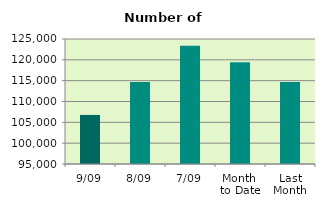
| Category | Series 0 |
|---|---|
| 9/09 | 106772 |
| 8/09 | 114698 |
| 7/09 | 123374 |
| Month 
to Date | 119407.714 |
| Last
Month | 114688 |